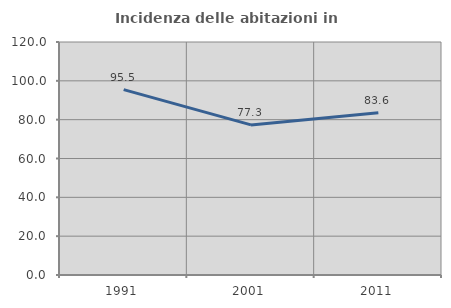
| Category | Incidenza delle abitazioni in proprietà  |
|---|---|
| 1991.0 | 95.495 |
| 2001.0 | 77.311 |
| 2011.0 | 83.621 |